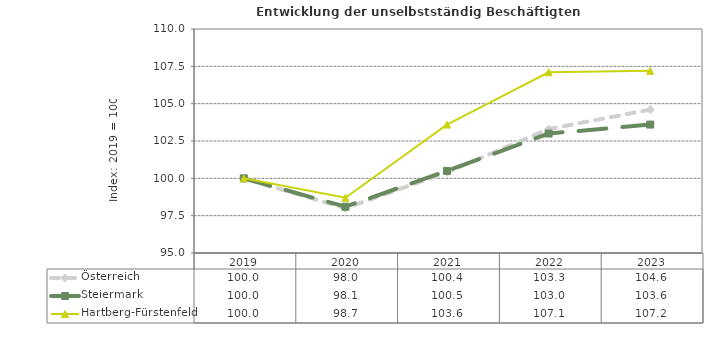
| Category | Österreich | Steiermark | Hartberg-Fürstenfeld |
|---|---|---|---|
| 2023.0 | 104.6 | 103.6 | 107.2 |
| 2022.0 | 103.3 | 103 | 107.1 |
| 2021.0 | 100.4 | 100.5 | 103.6 |
| 2020.0 | 98 | 98.1 | 98.7 |
| 2019.0 | 100 | 100 | 100 |